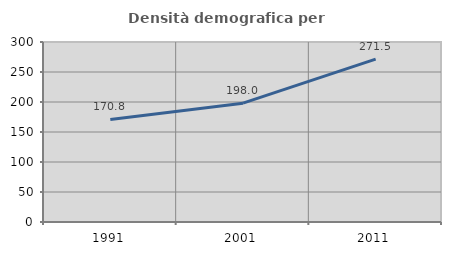
| Category | Densità demografica |
|---|---|
| 1991.0 | 170.85 |
| 2001.0 | 198.006 |
| 2011.0 | 271.468 |